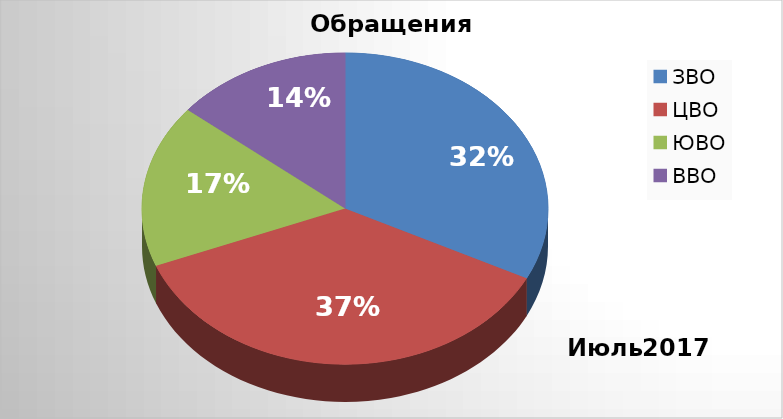
| Category | Series 0 |
|---|---|
| ЗВО | 23 |
| ЦВО | 26 |
| ЮВО | 12 |
| ВВО | 10 |